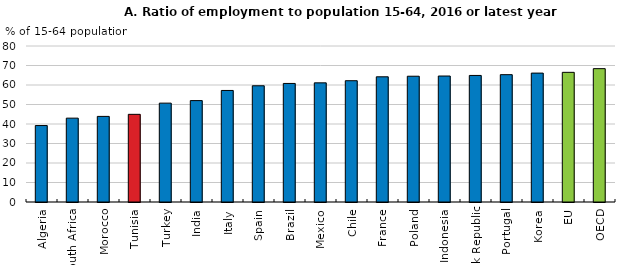
| Category | Men |
|---|---|
| Algeria | 39.2 |
| South Africa | 43 |
| Morocco | 43.9 |
| Tunisia | 44.958 |
| Turkey | 50.7 |
| India | 52 |
| Italy | 57.2 |
| Spain | 59.6 |
| Brazil | 60.8 |
| Mexico | 61.1 |
| Chile | 62.2 |
| France | 64.2 |
| Poland | 64.5 |
| Indonesia | 64.6 |
| Slovak Republic | 64.9 |
| Portugal | 65.3 |
| Korea | 66.1 |
| EU | 66.493 |
| OECD | 68.386 |